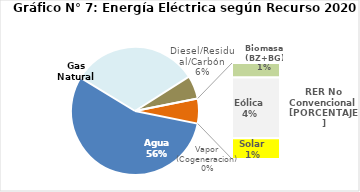
| Category | Series 0 |
|---|---|
| Agua | 2250.568 |
| Gas Natural | 1306.263 |
| Diesel/Residual/Carbón | 238.005 |
| Vapor (Cogeneracion) | 0.227 |
| Biomasa (BZ+BG) | 38.855 |
| Eólica | 161.987 |
| Solar | 55.071 |